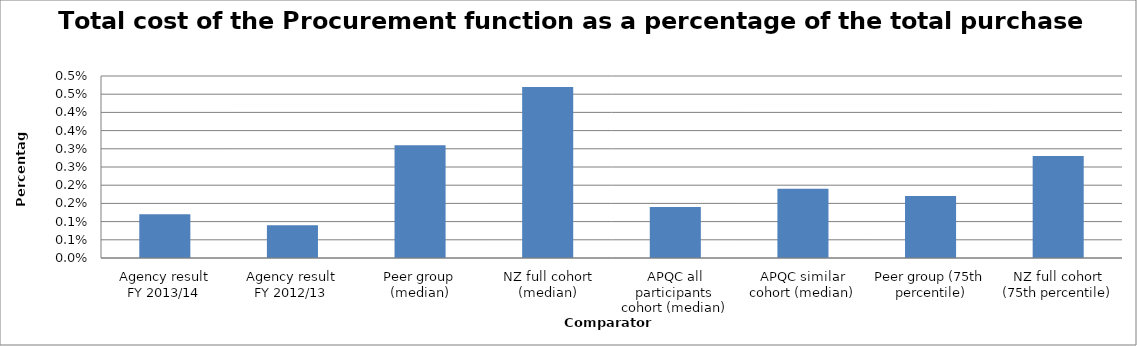
| Category | Result |
|---|---|
| Agency result
FY 2013/14 | 0.001 |
| Agency result
FY 2012/13 | 0.001 |
| Peer group (median) | 0.003 |
| NZ full cohort (median) | 0.005 |
| APQC all participants cohort (median) | 0.001 |
| APQC similar cohort (median) | 0.002 |
| Peer group (75th percentile) | 0.002 |
| NZ full cohort (75th percentile) | 0.003 |